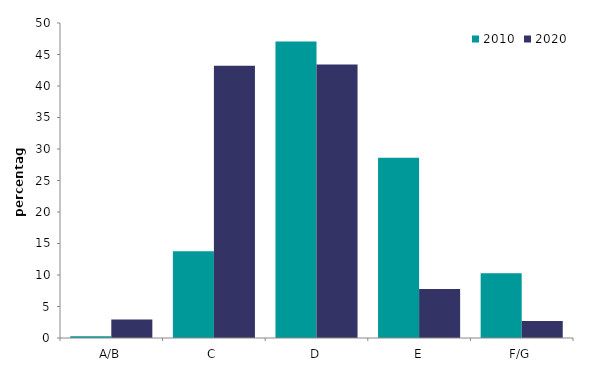
| Category | 2010 | 2020 |
|---|---|---|
| A/B | 0.272 | 2.929 |
| C | 13.774 | 43.199 |
| D | 47.052 | 43.416 |
| E | 28.624 | 7.766 |
| F/G | 10.279 | 2.689 |